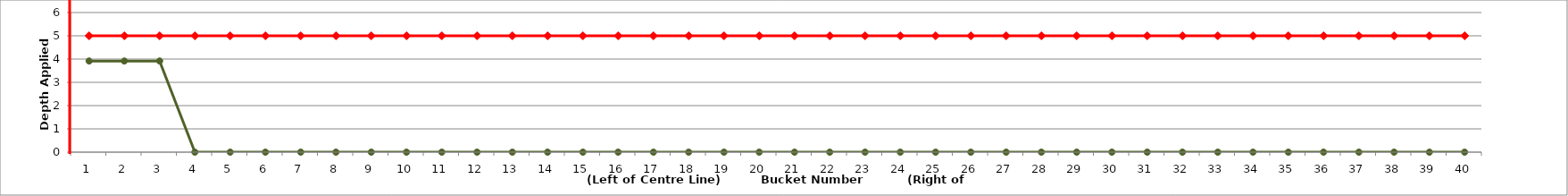
| Category | Maximum Allowable | Actual Applied Depth |
|---|---|---|
| 1.0 | 5 | 3.916 |
| 2.0 | 5 | 3.916 |
| 3.0 | 5 | 3.916 |
| 4.0 | 5 | 0 |
| 5.0 | 5 | 0 |
| 6.0 | 5 | 0 |
| 7.0 | 5 | 0 |
| 8.0 | 5 | 0 |
| 9.0 | 5 | 0 |
| 10.0 | 5 | 0 |
| 11.0 | 5 | 0 |
| 12.0 | 5 | 0 |
| 13.0 | 5 | 0 |
| 14.0 | 5 | 0 |
| 15.0 | 5 | 0 |
| 16.0 | 5 | 0 |
| 17.0 | 5 | 0 |
| 18.0 | 5 | 0 |
| 19.0 | 5 | 0 |
| 20.0 | 5 | 0 |
| 21.0 | 5 | 0 |
| 22.0 | 5 | 0 |
| 23.0 | 5 | 0 |
| 24.0 | 5 | 0 |
| 25.0 | 5 | 0 |
| 26.0 | 5 | 0 |
| 27.0 | 5 | 0 |
| 28.0 | 5 | 0 |
| 29.0 | 5 | 0 |
| 30.0 | 5 | 0 |
| 31.0 | 5 | 0 |
| 32.0 | 5 | 0 |
| 33.0 | 5 | 0 |
| 34.0 | 5 | 0 |
| 35.0 | 5 | 0 |
| 36.0 | 5 | 0 |
| 37.0 | 5 | 0 |
| 38.0 | 5 | 0 |
| 39.0 | 5 | 0 |
| 40.0 | 5 | 0 |